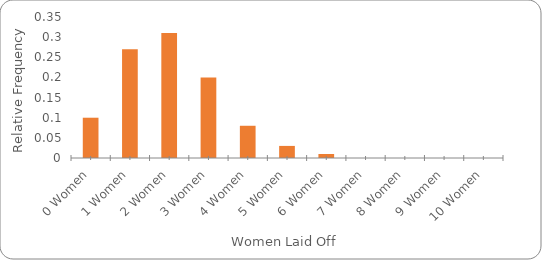
| Category | Series 0 |
|---|---|
| 0 Women | 0.1 |
| 1 Women | 0.27 |
| 2 Women | 0.31 |
| 3 Women | 0.2 |
| 4 Women | 0.08 |
| 5 Women | 0.03 |
| 6 Women | 0.01 |
| 7 Women | 0 |
| 8 Women | 0 |
| 9 Women | 0 |
| 10 Women | 0 |